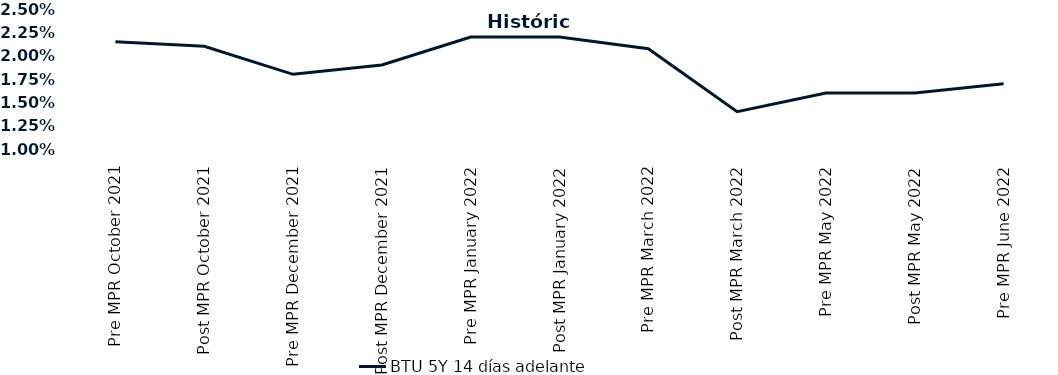
| Category | BTU 5Y 14 días adelante |
|---|---|
| Pre MPR October 2021 | 0.022 |
| Post MPR October 2021 | 0.021 |
| Pre MPR December 2021 | 0.018 |
| Post MPR December 2021 | 0.019 |
| Pre MPR January 2022 | 0.022 |
| Post MPR January 2022 | 0.022 |
| Pre MPR March 2022 | 0.021 |
| Post MPR March 2022 | 0.014 |
| Pre MPR May 2022 | 0.016 |
| Post MPR May 2022 | 0.016 |
| Pre MPR June 2022 | 0.017 |